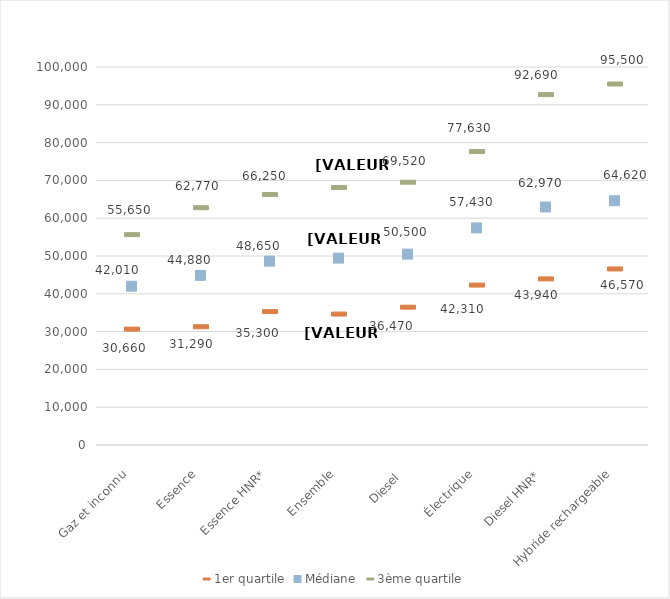
| Category | 1er quartile | Médiane | 3ème quartile |
|---|---|---|---|
| Gaz et inconnu | 30660 | 42010 | 55650 |
| Essence | 31290 | 44880 | 62770 |
| Essence HNR* | 35300 | 48650 | 66250 |
| Ensemble | 34640 | 49440 | 68130 |
| Diesel  | 36470 | 50500 | 69520 |
| Électrique | 42310 | 57430 | 77630 |
| Diesel HNR* | 43940 | 62970 | 92690 |
| Hybride rechargeable | 46570 | 64620 | 95500 |